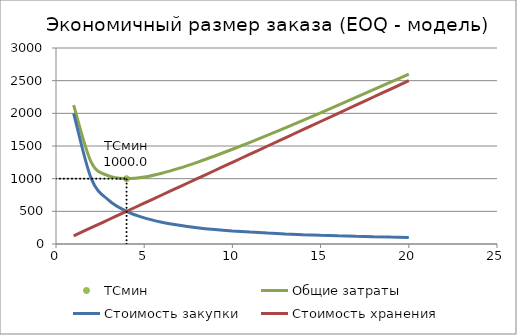
| Category | TСмин |
|---|---|
| 4.0 | 1000 |